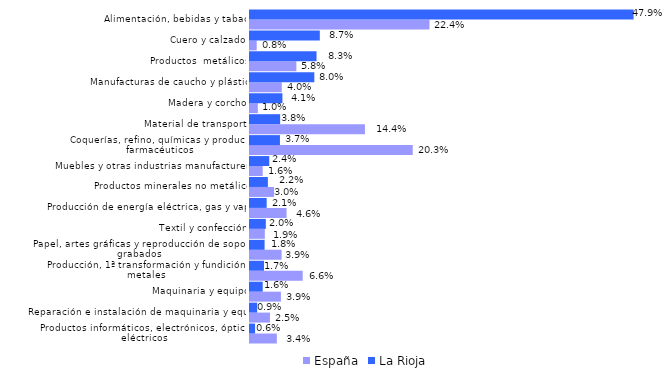
| Category | España | La Rioja |
|---|---|---|
| Productos informáticos, electrónicos, ópticos y eléctricos | 0.034 | 0.006 |
| Reparación e instalación de maquinaria y equipo | 0.025 | 0.009 |
| Maquinaria y equipo | 0.039 | 0.016 |
| Producción, 1ª transformación y fundición de metales | 0.066 | 0.017 |
| Papel, artes gráficas y reproducción de soportes grabados | 0.039 | 0.018 |
| Textil y confección | 0.019 | 0.02 |
| Producción de energía eléctrica, gas y vapor | 0.046 | 0.021 |
| Productos minerales no metálicos | 0.03 | 0.022 |
| Muebles y otras industrias manufactureras | 0.016 | 0.024 |
| Coquerías, refino, químicas y productos farmacéuticos | 0.203 | 0.037 |
| Material de transporte | 0.144 | 0.038 |
| Madera y corcho | 0.01 | 0.041 |
| Manufacturas de caucho y plástico | 0.04 | 0.08 |
| Productos  metálicos | 0.058 | 0.083 |
| Cuero y calzado | 0.008 | 0.087 |
| Alimentación, bebidas y tabaco | 0.224 | 0.479 |